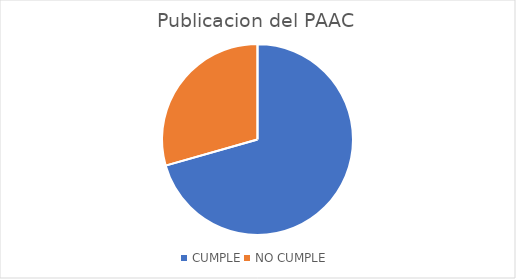
| Category | Series 0 |
|---|---|
| CUMPLE | 12 |
| NO CUMPLE  | 5 |